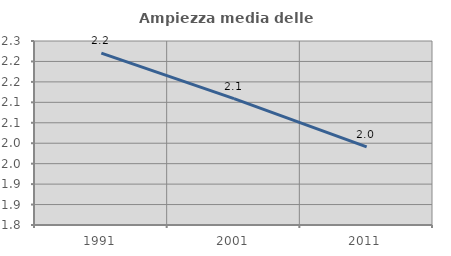
| Category | Ampiezza media delle famiglie |
|---|---|
| 1991.0 | 2.22 |
| 2001.0 | 2.109 |
| 2011.0 | 1.991 |